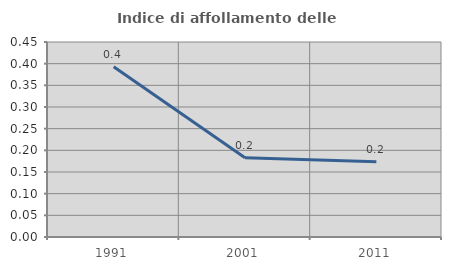
| Category | Indice di affollamento delle abitazioni  |
|---|---|
| 1991.0 | 0.393 |
| 2001.0 | 0.183 |
| 2011.0 | 0.173 |